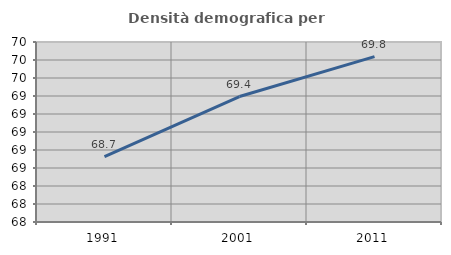
| Category | Densità demografica |
|---|---|
| 1991.0 | 68.727 |
| 2001.0 | 69.394 |
| 2011.0 | 69.838 |